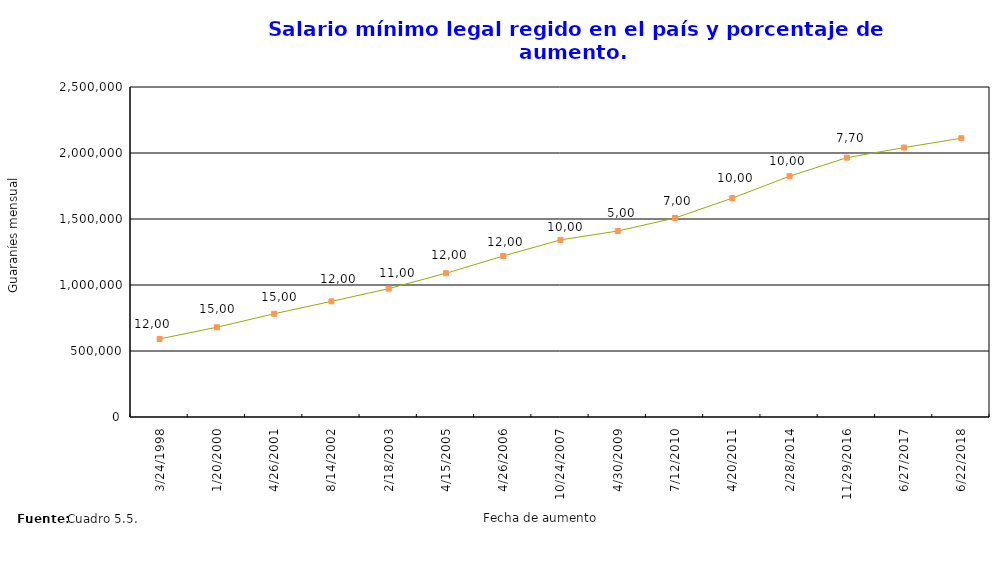
| Category | Guaraníes mensual |
|---|---|
| 3/24/98 | 591445 |
| 1/20/00 | 680162 |
| 4/26/01 | 782186 |
| 8/14/02 | 876048 |
| 2/18/03 | 972413 |
| 4/15/05 | 1089103 |
| 4/26/06 | 1219795 |
| 10/24/07 | 1341795 |
| 4/30/09 | 1408864 |
| 7/12/10 | 1507484 |
| 4/20/11 | 1658232 |
| 2/28/14 | 1824055 |
| 11/29/16 | 1964507 |
| 6/27/17 | 2041123 |
| 6/22/18 | 2112562 |